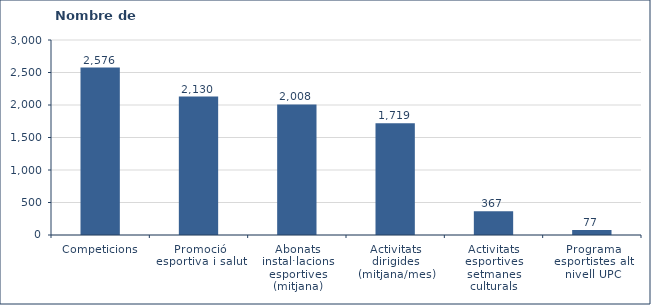
| Category | Nombre de participants |
|---|---|
| Competicions | 2576 |
| Promoció esportiva i salut | 2130 |
| Abonats instal·lacions esportives (mitjana) | 2008 |
| Activitats dirigides (mitjana/mes) | 1719 |
| Activitats esportives setmanes culturals | 367 |
| Programa esportistes alt nivell UPC | 77 |